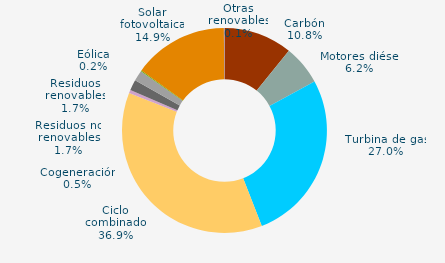
| Category | Series 0 |
|---|---|
| Carbón | 10.807 |
| Motores diésel | 6.246 |
| Turbina de gas | 27.023 |
| Ciclo combinado | 36.871 |
| Generación auxiliar | 0 |
| Cogeneración | 0.516 |
| Residuos no renovables | 1.676 |
| Residuos renovables | 1.676 |
| Eólica | 0.16 |
| Solar fotovoltaica | 14.93 |
| Otras renovables | 0.095 |